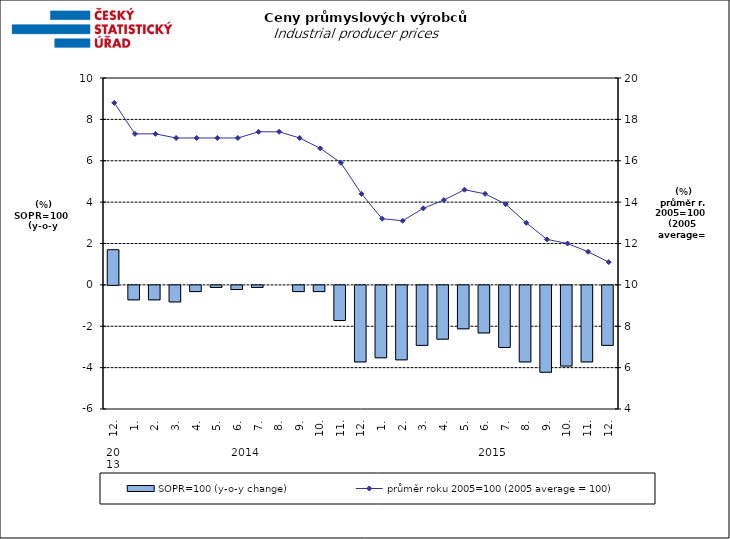
| Category | SOPR=100 (y-o-y change)   |
|---|---|
| 0 | 1.7 |
| 1 | -0.7 |
| 2 | -0.7 |
| 3 | -0.8 |
| 4 | -0.3 |
| 5 | -0.1 |
| 6 | -0.2 |
| 7 | -0.1 |
| 8 | 0 |
| 9 | -0.3 |
| 10 | -0.3 |
| 11 | -1.7 |
| 12 | -3.7 |
| 13 | -3.5 |
| 14 | -3.6 |
| 15 | -2.9 |
| 16 | -2.6 |
| 17 | -2.1 |
| 18 | -2.3 |
| 19 | -3 |
| 20 | -3.7 |
| 21 | -4.2 |
| 22 | -3.9 |
| 23 | -3.7 |
| 24 | -2.9 |